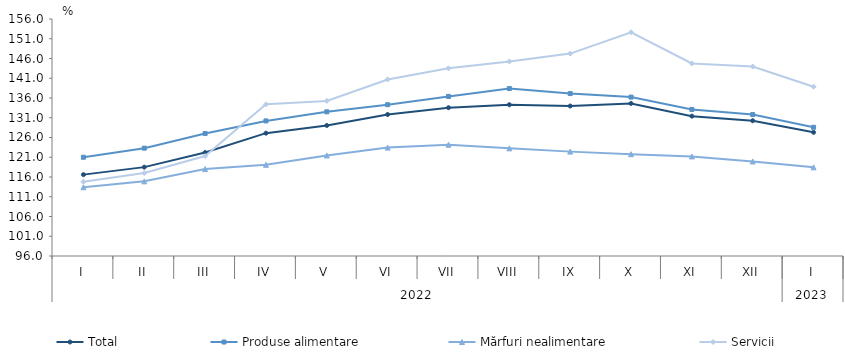
| Category | Total  | Produse alimentare | Mărfuri nealimentare  | Servicii |
|---|---|---|---|---|
| 0 | 116.6 | 121 | 113.4 | 114.8 |
| 1 | 118.5 | 123.3 | 114.9 | 117 |
| 2 | 122.2 | 127 | 118 | 121.3 |
| 3 | 127.1 | 130.2 | 119.1 | 134.4 |
| 4 | 129.047 | 132.5 | 121.45 | 135.267 |
| 5 | 131.827 | 134.301 | 123.443 | 140.701 |
| 6 | 133.547 | 136.399 | 124.168 | 143.511 |
| 7 | 134.294 | 138.387 | 123.256 | 145.253 |
| 8 | 133.971 | 137.121 | 122.424 | 147.248 |
| 9 | 134.625 | 136.226 | 121.779 | 152.646 |
| 10 | 131.406 | 133.093 | 121.201 | 144.742 |
| 11 | 130.241 | 131.801 | 119.936 | 143.965 |
| 12 | 127.307 | 128.59 | 118.441 | 138.865 |